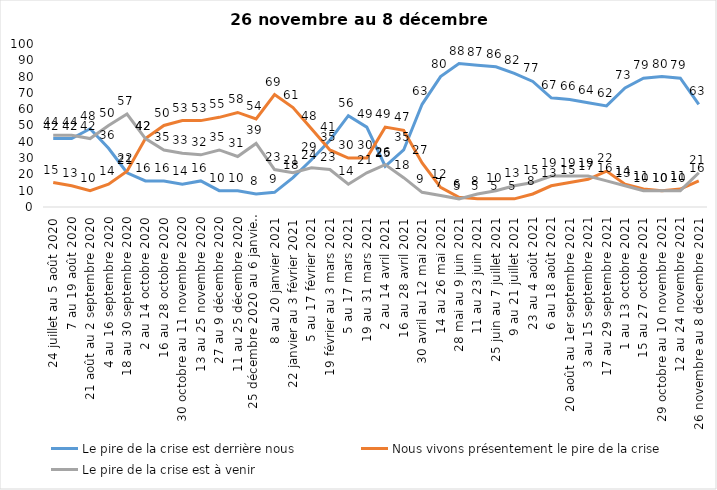
| Category | Le pire de la crise est derrière nous | Nous vivons présentement le pire de la crise | Le pire de la crise est à venir |
|---|---|---|---|
| 24 juillet au 5 août 2020 | 42 | 15 | 44 |
| 7 au 19 août 2020 | 42 | 13 | 44 |
| 21 août au 2 septembre 2020 | 48 | 10 | 42 |
| 4 au 16 septembre 2020 | 36 | 14 | 50 |
| 18 au 30 septembre 2020 | 21 | 22 | 57 |
| 2 au 14 octobre 2020 | 16 | 42 | 42 |
| 16 au 28 octobre 2020 | 16 | 50 | 35 |
| 30 octobre au 11 novembre 2020 | 14 | 53 | 33 |
| 13 au 25 novembre 2020 | 16 | 53 | 32 |
| 27 au 9 décembre 2020 | 10 | 55 | 35 |
| 11 au 25 décembre 2020 | 10 | 58 | 31 |
| 25 décembre 2020 au 6 janvier 2021 | 8 | 54 | 39 |
| 8 au 20 janvier 2021 | 9 | 69 | 23 |
| 22 janvier au 3 février 2021 | 18 | 61 | 21 |
| 5 au 17 février 2021 | 29 | 48 | 24 |
| 19 février au 3 mars 2021 | 41 | 35 | 23 |
| 5 au 17 mars 2021 | 56 | 30 | 14 |
| 19 au 31 mars 2021 | 49 | 30 | 21 |
| 2 au 14 avril 2021 | 25 | 49 | 26 |
| 16 au 28 avril 2021 | 35 | 47 | 18 |
| 30 avril au 12 mai 2021 | 63 | 27 | 9 |
| 14 au 26 mai 2021 | 80 | 12 | 7 |
| 28 mai au 9 juin 2021 | 88 | 6 | 5 |
| 11 au 23 juin 2021 | 87 | 5 | 8 |
| 25 juin au 7 juillet 2021 | 86 | 5 | 10 |
| 9 au 21 juillet 2021 | 82 | 5 | 13 |
| 23 au 4 août 2021 | 77 | 8 | 15 |
| 6 au 18 août 2021 | 67 | 13 | 19 |
| 20 août au 1er septembre 2021 | 66 | 15 | 19 |
| 3 au 15 septembre 2021 | 64 | 17 | 19 |
| 17 au 29 septembre 2021 | 62 | 22 | 16 |
| 1 au 13 octobre 2021 | 73 | 14 | 13 |
| 15 au 27 octobre 2021 | 79 | 11 | 10 |
| 29 octobre au 10 novembre 2021 | 80 | 10 | 10 |
| 12 au 24 novembre 2021 | 79 | 11 | 10 |
| 26 novembre au 8 décembre 2021 | 63 | 16 | 21 |